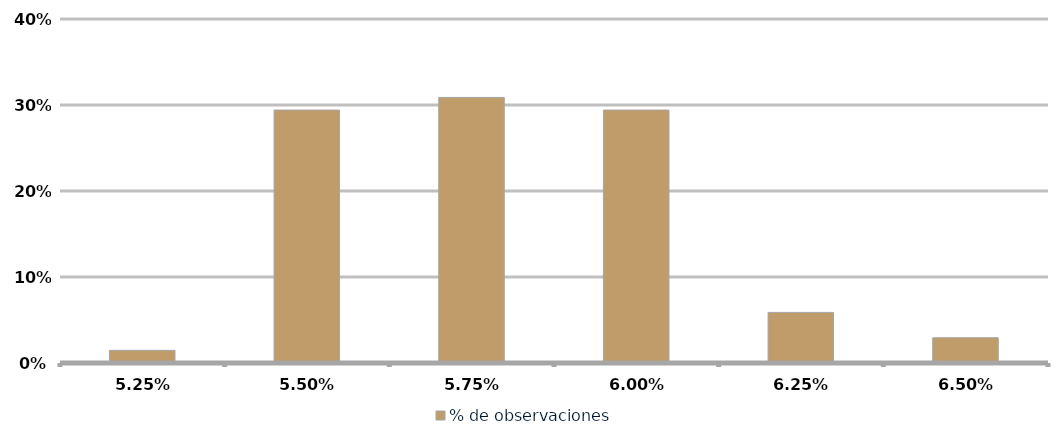
| Category | % de observaciones  |
|---|---|
| 0.0525 | 0.015 |
| 0.055 | 0.294 |
| 0.0575 | 0.309 |
| 0.060000000000000005 | 0.294 |
| 0.0625 | 0.059 |
| 0.065 | 0.029 |